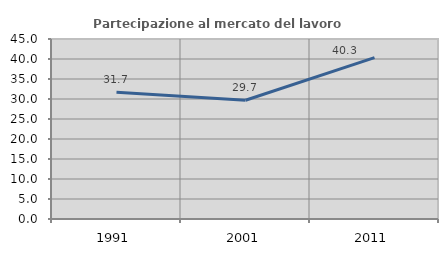
| Category | Partecipazione al mercato del lavoro  femminile |
|---|---|
| 1991.0 | 31.707 |
| 2001.0 | 29.683 |
| 2011.0 | 40.336 |